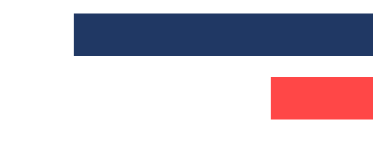
| Category | Series 0 |
|---|---|
| 0 | 1923500 |
| 1 | 652500 |